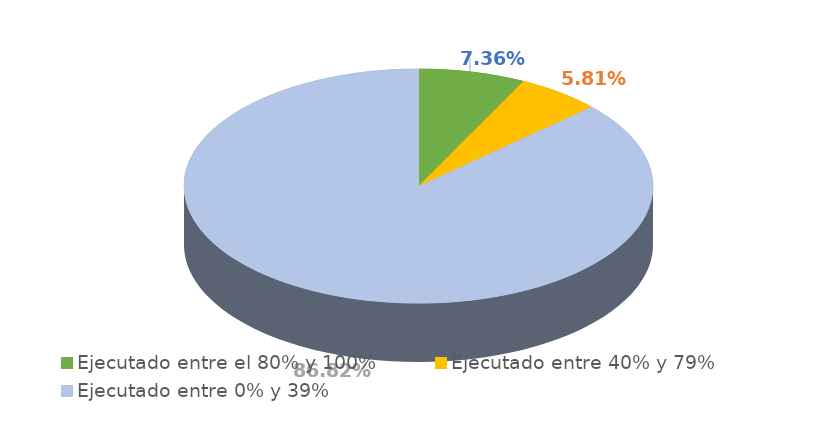
| Category | Series 0 |
|---|---|
| Ejecutado entre el 80% y 100% | 0.074 |
| Ejecutado entre 40% y 79% | 0.058 |
| Ejecutado entre 0% y 39% | 0.868 |